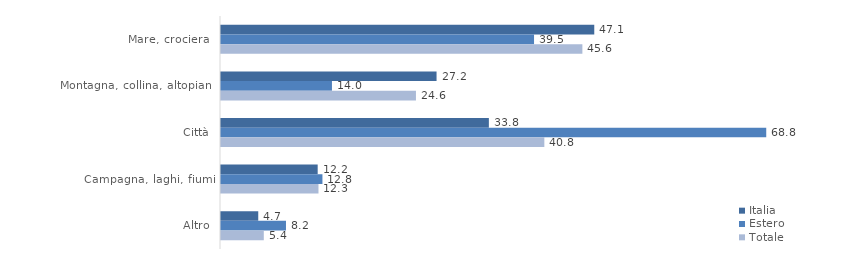
| Category | Italia | Estero | Totale |
|---|---|---|---|
| Mare, crociera  | 47.1 | 39.5 | 45.6 |
| Montagna, collina, altopiani | 27.2 | 14 | 24.6 |
| Città | 33.8 | 68.8 | 40.8 |
| Campagna, laghi, fiumi | 12.2 | 12.8 | 12.3 |
| Altro | 4.7 | 8.2 | 5.4 |